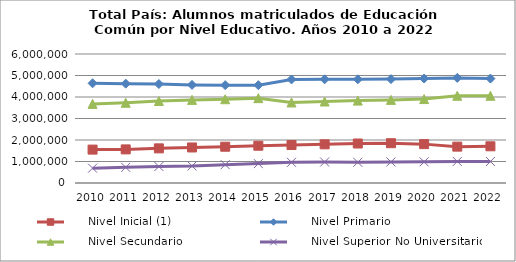
| Category |      Nivel Inicial (1) |      Nivel Primario |      Nivel Secundario |      Nivel Superior No Universitario |
|---|---|---|---|---|
| 2010.0 | 1553418 | 4637463 | 3679628 | 691007 |
| 2011.0 | 1563013 | 4620306 | 3731208 | 727444 |
| 2012.0 | 1610845 | 4603422 | 3813545 | 767698 |
| 2013.0 | 1652657 | 4563491 | 3866119 | 793018 |
| 2014.0 | 1687543 | 4550923 | 3896467 | 853853 |
| 2015.0 | 1733374 | 4550365 | 3946834 | 902316 |
| 2016.0 | 1765405 | 4814965 | 3746170 | 961048 |
| 2017.0 | 1798831 | 4822602 | 3791310 | 976466 |
| 2018.0 | 1836781 | 4822689 | 3832054 | 962493 |
| 2019.0 | 1851601 | 4832979 | 3866041 | 980020 |
| 2020.0 | 1807986 | 4859105 | 3904519 | 984397 |
| 2021.0 | 1691446 | 4887910 | 4057348 | 1001154 |
| 2022.0 | 1706658 | 4856155 | 4056769 | 1000544 |